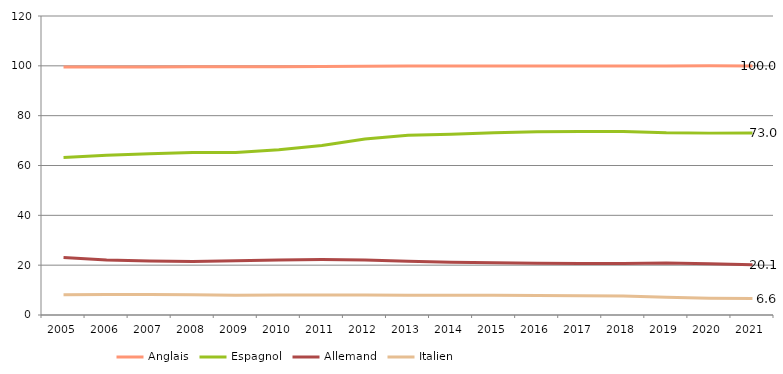
| Category | Anglais | Espagnol | Allemand | Italien |
|---|---|---|---|---|
| 2005 | 99.536 | 63.249 | 23.031 | 8.132 |
| 2006 | 99.528 | 64.127 | 22.042 | 8.245 |
| 2007 | 99.55 | 64.682 | 21.7 | 8.273 |
| 2008 | 99.595 | 65.253 | 21.481 | 8.116 |
| 2009 | 99.605 | 65.252 | 21.747 | 7.906 |
| 2010 | 99.679 | 66.328 | 22.056 | 8.052 |
| 2011 | 99.721 | 68.072 | 22.23 | 8.011 |
| 2012 | 99.832 | 70.675 | 22.087 | 8.016 |
| 2013 | 99.894 | 72.116 | 21.537 | 7.97 |
| 2014 | 99.901 | 72.504 | 21.176 | 7.931 |
| 2015 | 99.943 | 73.101 | 20.932 | 7.914 |
| 2016 | 99.959 | 73.527 | 20.806 | 7.822 |
| 2017 | 99.951 | 73.663 | 20.685 | 7.714 |
| 2018 | 99.948 | 73.683 | 20.624 | 7.628 |
| 2019 | 99.962 | 73.134 | 20.867 | 7.154 |
| 2020 | 100.023 | 72.993 | 20.537 | 6.713 |
| 2021 | 99.955 | 73.025 | 20.118 | 6.592 |